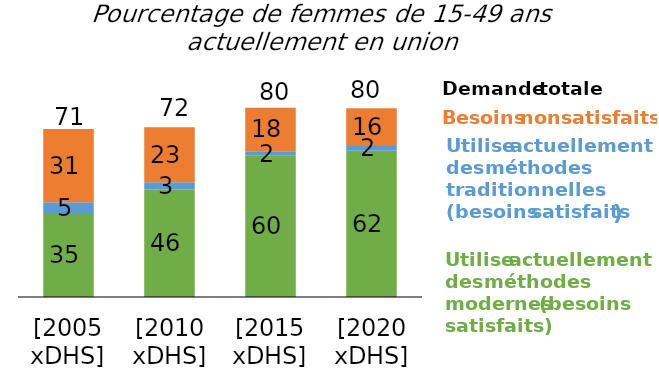
| Category | Besoins en méthodes modernes satisfaits | Besoins en méthodes traditionnelles satisfaits | Besoins non satisfaits |
|---|---|---|---|
| [2005 xDHS] | 35.2 | 5 | 31 |
| [2010 xDHS] | 45.6 | 3 | 23.3 |
| [2015 xDHS] | 59.8 | 2 | 18.4 |
| [2020 xDHS] | 62 | 2 | 16 |